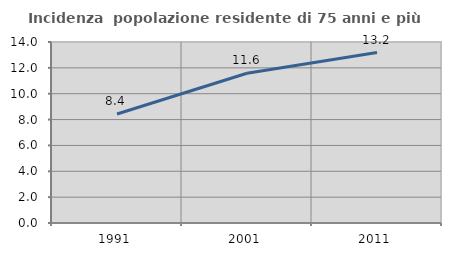
| Category | Incidenza  popolazione residente di 75 anni e più |
|---|---|
| 1991.0 | 8.431 |
| 2001.0 | 11.586 |
| 2011.0 | 13.185 |